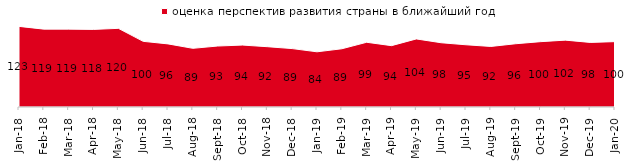
| Category | оценка перспектив развития страны в ближайший год |
|---|---|
| 2018-01-01 | 122.9 |
| 2018-02-01 | 118.7 |
| 2018-03-01 | 118.7 |
| 2018-04-01 | 118.3 |
| 2018-05-01 | 119.9 |
| 2018-06-01 | 100.1 |
| 2018-07-01 | 96.2 |
| 2018-08-01 | 89.45 |
| 2018-09-01 | 92.95 |
| 2018-10-01 | 94.4 |
| 2018-11-01 | 91.916 |
| 2018-12-01 | 89.05 |
| 2019-01-01 | 84.15 |
| 2019-02-01 | 88.75 |
| 2019-03-01 | 98.657 |
| 2019-04-01 | 93.515 |
| 2019-05-01 | 103.764 |
| 2019-06-01 | 97.955 |
| 2019-07-01 | 94.851 |
| 2019-08-01 | 92.308 |
| 2019-09-01 | 96.436 |
| 2019-10-01 | 99.604 |
| 2019-11-01 | 101.931 |
| 2019-12-01 | 98.465 |
| 2020-01-01 | 99.653 |